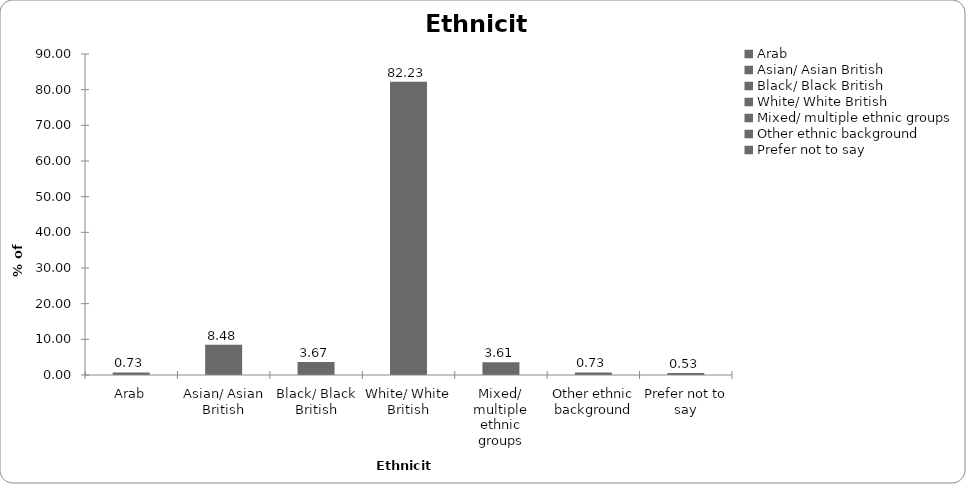
| Category | Ethnicity |
|---|---|
| Arab | 0.735 |
| Asian/ Asian British | 8.484 |
| Black/ Black British | 3.674 |
| White/ White British | 82.231 |
| Mixed/ multiple ethnic groups | 3.607 |
| Other ethnic background | 0.735 |
| Prefer not to say | 0.534 |